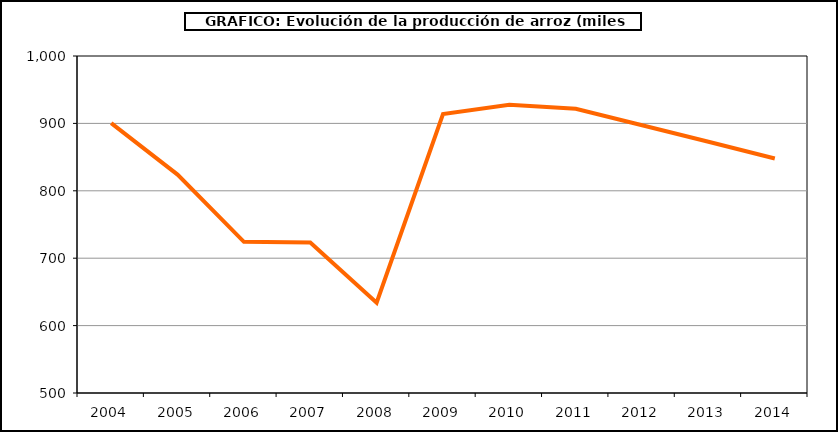
| Category | Superficie |
|---|---|
| 2004.0 | 900.4 |
| 2005.0 | 824.114 |
| 2006.0 | 724.351 |
| 2007.0 | 723.426 |
| 2008.0 | 633.987 |
| 2009.0 | 913.754 |
| 2010.0 | 927.817 |
| 2011.0 | 921.738 |
| 2012.0 | 897.318 |
| 2013.0 | 872.689 |
| 2014.0 | 847.976 |